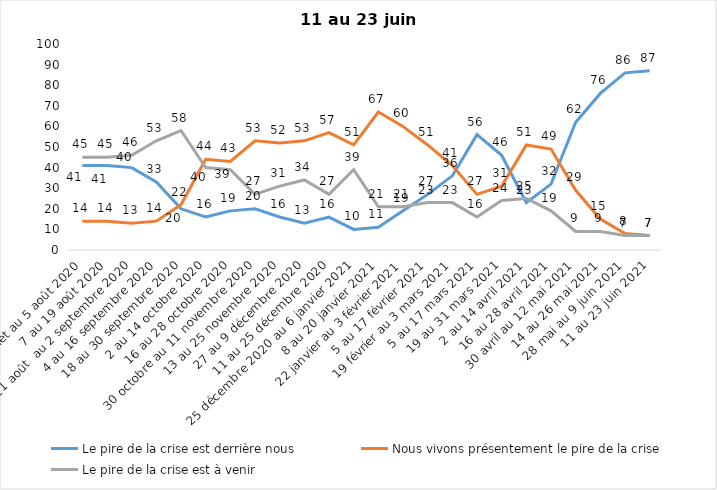
| Category | Le pire de la crise est derrière nous | Nous vivons présentement le pire de la crise | Le pire de la crise est à venir |
|---|---|---|---|
| 24 juillet au 5 août 2020 | 41 | 14 | 45 |
| 7 au 19 août 2020 | 41 | 14 | 45 |
| 21 août  au 2 septembre 2020 | 40 | 13 | 46 |
| 4 au 16 septembre 2020 | 33 | 14 | 53 |
| 18 au 30 septembre 2020 | 20 | 22 | 58 |
| 2 au 14 octobre 2020 | 16 | 44 | 40 |
| 16 au 28 octobre 2020 | 19 | 43 | 39 |
| 30 octobre au 11 novembre 2020 | 20 | 53 | 27 |
| 13 au 25 novembre 2020 | 16 | 52 | 31 |
| 27 au 9 décembre 2020 | 13 | 53 | 34 |
| 11 au 25 décembre 2020 | 16 | 57 | 27 |
| 25 décembre 2020 au 6 janvier 2021 | 10 | 51 | 39 |
| 8 au 20 janvier 2021 | 11 | 67 | 21 |
| 22 janvier au 3 février 2021 | 19 | 60 | 21 |
| 5 au 17 février 2021 | 27 | 51 | 23 |
| 19 février au 3 mars 2021 | 36 | 41 | 23 |
| 5 au 17 mars 2021 | 56 | 27 | 16 |
| 19 au 31 mars 2021 | 46 | 31 | 24 |
| 2 au 14 avril 2021 | 23 | 51 | 25 |
| 16 au 28 avril 2021 | 32 | 49 | 19 |
| 30 avril au 12 mai 2021 | 62 | 29 | 9 |
| 14 au 26 mai 2021 | 76 | 15 | 9 |
| 28 mai au 9 juin 2021 | 86 | 8 | 7 |
| 11 au 23 juin 2021 | 87 | 7 | 7 |